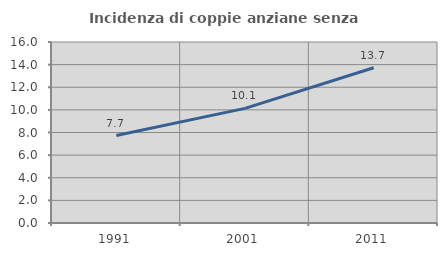
| Category | Incidenza di coppie anziane senza figli  |
|---|---|
| 1991.0 | 7.733 |
| 2001.0 | 10.134 |
| 2011.0 | 13.728 |